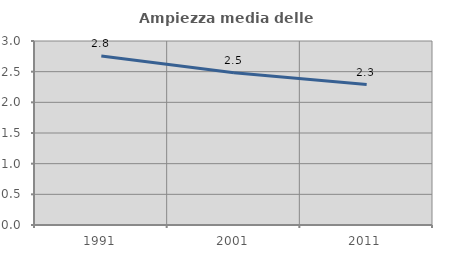
| Category | Ampiezza media delle famiglie |
|---|---|
| 1991.0 | 2.756 |
| 2001.0 | 2.482 |
| 2011.0 | 2.289 |